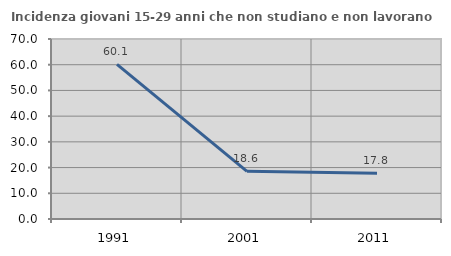
| Category | Incidenza giovani 15-29 anni che non studiano e non lavorano  |
|---|---|
| 1991.0 | 60.124 |
| 2001.0 | 18.551 |
| 2011.0 | 17.778 |